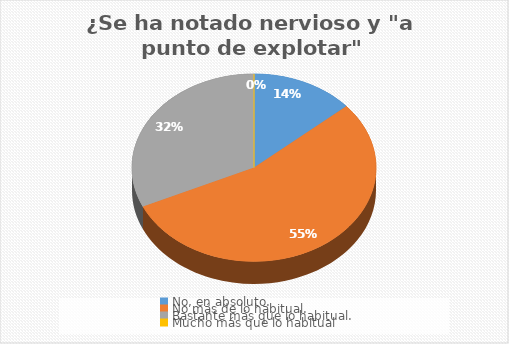
| Category | ¿Se ha notado nervioso y "a punto de explotar" constantemente? |
|---|---|
| No, en absoluto. | 15 |
| No más de lo habitual. | 60 |
| Bastante más que lo habitual. | 35 |
| Mucho más que lo habitual | 0 |